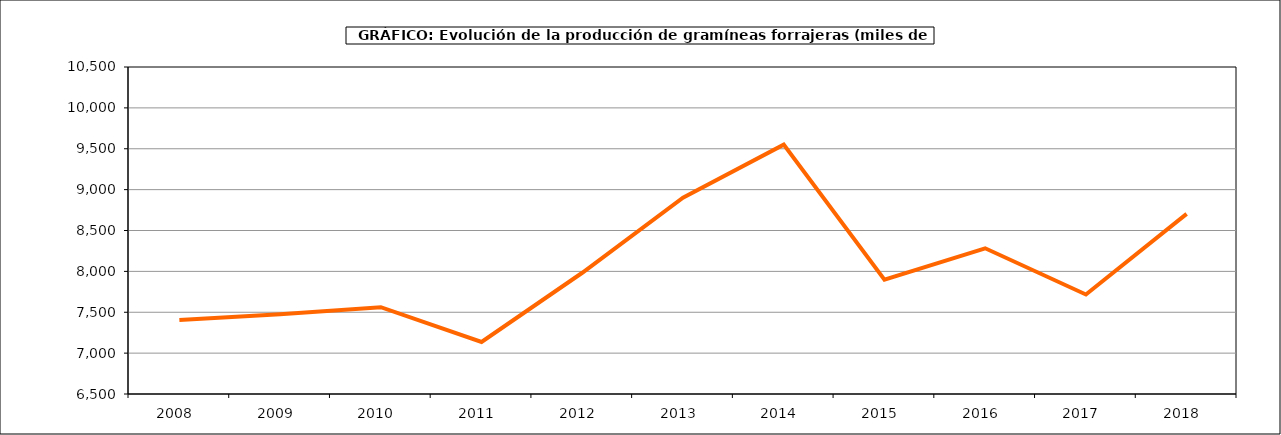
| Category | Superficie |
|---|---|
| 2008.0 | 7406.618 |
| 2009.0 | 7476.074 |
| 2010.0 | 7562.029 |
| 2011.0 | 7137.239 |
| 2012.0 | 7983.127 |
| 2013.0 | 8902.06 |
| 2014.0 | 9549.995 |
| 2015.0 | 7898.371 |
| 2016.0 | 8282.503 |
| 2017.0 | 7716.979 |
| 2018.0 | 8703.004 |